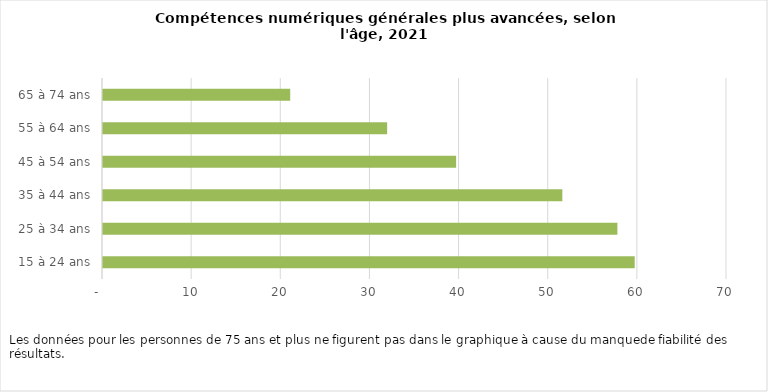
| Category | 2021 |
|---|---|
| 15 à 24 ans | 59.647 |
| 25 à 34 ans | 57.705 |
| 35 à 44 ans | 51.528 |
| 45 à 54 ans | 39.614 |
| 55 à 64 ans | 31.874 |
| 65 à 74 ans | 21 |